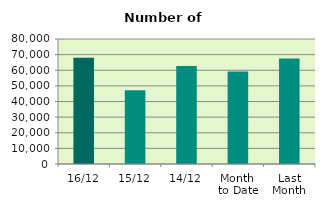
| Category | Series 0 |
|---|---|
| 16/12 | 67996 |
| 15/12 | 47232 |
| 14/12 | 62656 |
| Month 
to Date | 59190.5 |
| Last
Month | 67470.455 |